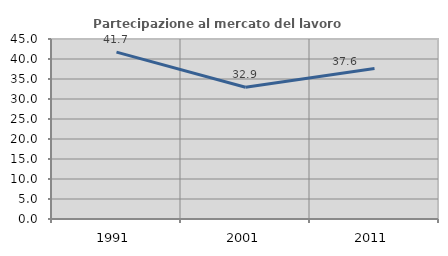
| Category | Partecipazione al mercato del lavoro  femminile |
|---|---|
| 1991.0 | 41.724 |
| 2001.0 | 32.938 |
| 2011.0 | 37.649 |